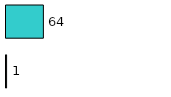
| Category | Series 0 | Series 1 |
|---|---|---|
| 0 | 1 | 64 |